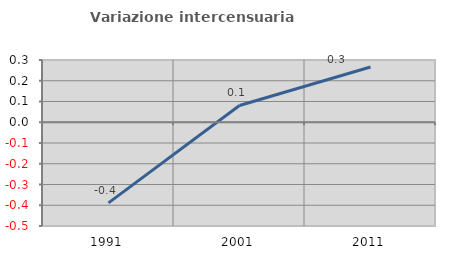
| Category | Variazione intercensuaria annua |
|---|---|
| 1991.0 | -0.389 |
| 2001.0 | 0.081 |
| 2011.0 | 0.266 |